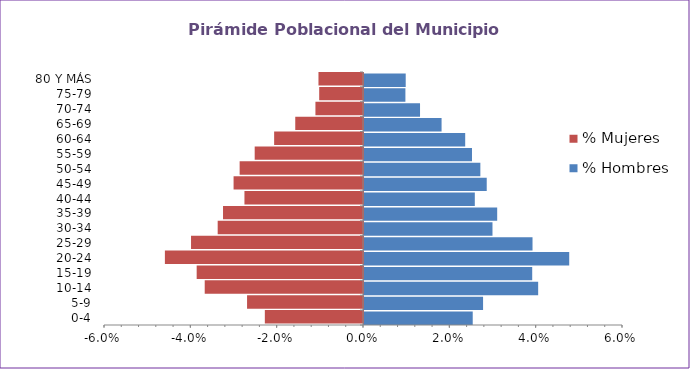
| Category | % Hombres | % Mujeres |
|---|---|---|
| 0-4 | 0.025 | -0.023 |
| 5-9 | 0.028 | -0.027 |
| 10-14 | 0.04 | -0.037 |
| 15-19 | 0.039 | -0.039 |
| 20-24 | 0.048 | -0.046 |
| 25-29 | 0.039 | -0.04 |
| 30-34 | 0.03 | -0.034 |
| 35-39 | 0.031 | -0.032 |
| 40-44 | 0.026 | -0.027 |
| 45-49 | 0.028 | -0.03 |
| 50-54 | 0.027 | -0.029 |
| 55-59 | 0.025 | -0.025 |
| 60-64 | 0.023 | -0.021 |
| 65-69 | 0.018 | -0.016 |
| 70-74 | 0.013 | -0.011 |
| 75-79 | 0.01 | -0.01 |
| 80 Y MÁS | 0.01 | -0.01 |